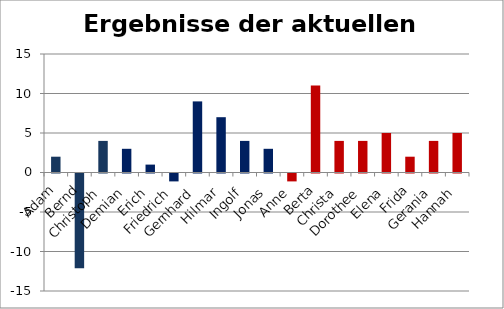
| Category | Series 0 |
|---|---|
| Adam | 2 |
| Bernd | -12 |
| Christoph | 4 |
| Demian | 3 |
| Erich | 1 |
| Friedrich | -1 |
| Gernhard | 9 |
| Hilmar | 7 |
| Ingolf | 4 |
| Jonas | 3 |
| Anne | -1 |
| Berta | 11 |
| Christa | 4 |
| Dorothee | 4 |
| Elena | 5 |
| Frida | 2 |
| Gerania | 4 |
| Hannah | 5 |